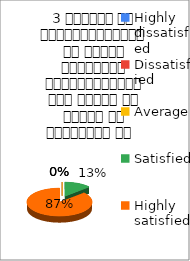
| Category | 3 शिक्षक का विद्यार्थियों के प्रति व्यव्हार मित्रतापूर्ण एवं सहयोग के भावना से परिपूर्ण था   |
|---|---|
| Highly dissatisfied | 0 |
| Dissatisfied | 0 |
| Average | 0 |
| Satisfied | 2 |
| Highly satisfied | 13 |